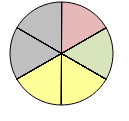
| Category | Series 1 |
|---|---|
| + + | 0 |
| + | 0 |
| o | 0 |
| - | 1 |
| - - | 0 |
| + + | 0 |
| + | 1 |
| o | 0 |
| - | 0 |
| - - | 0 |
| + + | 0 |
| + | 0 |
| o | 1 |
| - | 0 |
| - - | 0 |
| + + | 0 |
| + | 0 |
| o | 1 |
| - | 0 |
| - - | 0 |
| * * | 0 |
| * | 1 |
| o | 0 |
| * * | 0 |
| * | 1 |
| o | 0 |